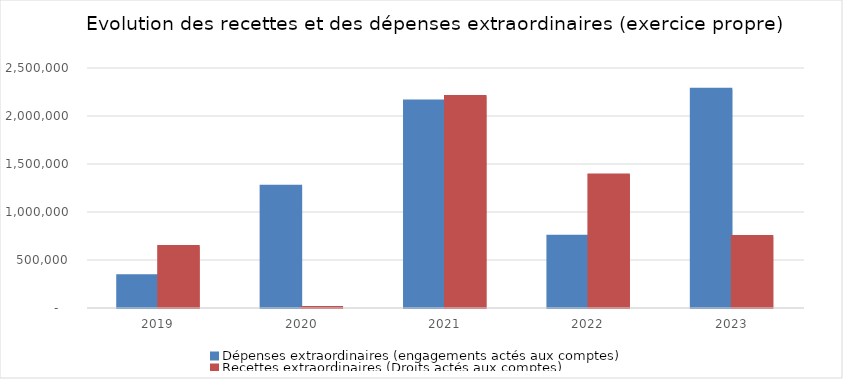
| Category | Dépenses extraordinaires (engagements actés aux comptes) | Recettes extraordinaires (Droits actés aux comptes) |
|---|---|---|
| 2019.0 | 335646.25 | 640965.33 |
| 2020.0 | 1269070.2 | 5660.02 |
| 2021.0 | 2157046.6 | 2203257.34 |
| 2022.0 | 746831.83 | 1384897.37 |
| 2023.0 | 2279529.09 | 743522.06 |